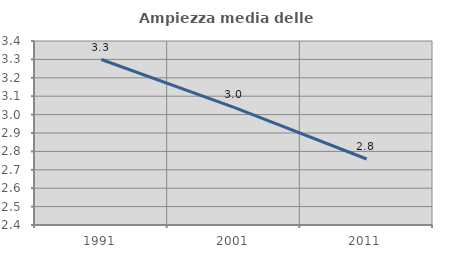
| Category | Ampiezza media delle famiglie |
|---|---|
| 1991.0 | 3.299 |
| 2001.0 | 3.04 |
| 2011.0 | 2.759 |